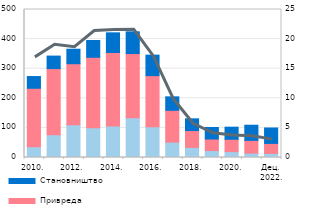
| Category | Остали сектори | Привреда | Становништво |
|---|---|---|---|
| 2010. | 36.3 | 197.6 | 39.6 |
| 2011. | 77.1 | 223.3 | 42.2 |
| 2012. | 110.5 | 206.3 | 49 |
| 2013. | 100.2 | 238.4 | 56.7 |
| 2014. | 106.4 | 248.4 | 66.4 |
| 2015. | 134.4 | 216.8 | 73.4 |
| 2016. | 103.8 | 172.8 | 69.2 |
| 2017. | 51.9 | 107.6 | 45.4 |
| 2018. | 34.192 | 56.849 | 39.608 |
| 2019. | 23.45 | 38.949 | 39.017 |
| 2020. | 19.835 | 41.827 | 40.747 |
| 2021. | 14.723 | 43.14 | 51.148 |
| Дец.
2022. | 13.706 | 33.931 | 52.057 |